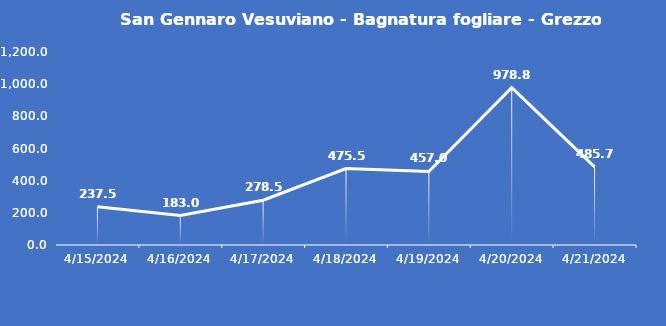
| Category | San Gennaro Vesuviano - Bagnatura fogliare - Grezzo (min) |
|---|---|
| 4/15/24 | 237.5 |
| 4/16/24 | 183 |
| 4/17/24 | 278.5 |
| 4/18/24 | 475.5 |
| 4/19/24 | 457 |
| 4/20/24 | 978.8 |
| 4/21/24 | 485.7 |